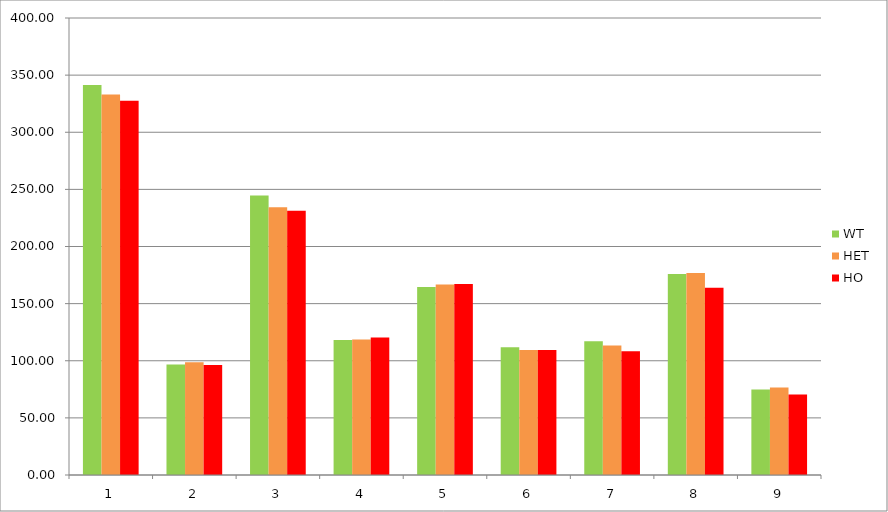
| Category | WT | HET | HO |
|---|---|---|---|
| 0 | 341.394 | 333.05 | 327.581 |
| 1 | 96.653 | 98.589 | 96.215 |
| 2 | 244.741 | 234.461 | 231.365 |
| 3 | 118.218 | 118.654 | 120.354 |
| 4 | 164.541 | 166.793 | 167.108 |
| 5 | 111.835 | 109.518 | 109.496 |
| 6 | 117.088 | 113.3 | 108.208 |
| 7 | 175.982 | 176.725 | 163.935 |
| 8 | 74.771 | 76.643 | 70.558 |